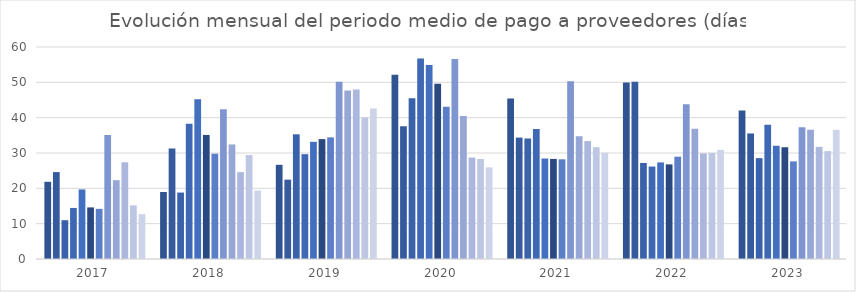
| Category | ene | feb | mar | abr | may | jun | jul | ago | sep | oct | nov | dic |
|---|---|---|---|---|---|---|---|---|---|---|---|---|
| 2023.0 | 42.02 | 35.53 | 28.55 | 37.98 | 32.05 | 31.63 | 27.63 | 37.3 | 36.61 | 31.74 | 30.53 | 36.61 |
| 2022.0 | 49.94 | 50.18 | 27.18 | 26.17 | 27.34 | 26.78 | 28.96 | 43.79 | 36.87 | 29.88 | 30.03 | 30.87 |
| 2021.0 | 45.41 | 34.36 | 34.11 | 36.77 | 28.44 | 28.32 | 28.22 | 50.29 | 34.75 | 33.38 | 31.64 | 30.05 |
| 2020.0 | 52.16 | 37.55 | 45.48 | 56.76 | 54.91 | 49.61 | 43.07 | 56.59 | 40.45 | 28.71 | 28.3 | 25.94 |
| 2019.0 | 26.66 | 22.46 | 35.29 | 29.67 | 33.16 | 33.93 | 34.43 | 50.15 | 47.69 | 47.99 | 40.02 | 42.57 |
| 2018.0 | 18.97 | 31.28 | 18.8 | 38.3 | 45.19 | 35.11 | 29.8 | 42.36 | 32.43 | 24.58 | 29.42 | 19.37 |
| 2017.0 | 21.85 | 24.6 | 10.98 | 14.45 | 19.69 | 14.6 | 14.19 | 35.1 | 22.31 | 27.37 | 15.17 | 12.69 |